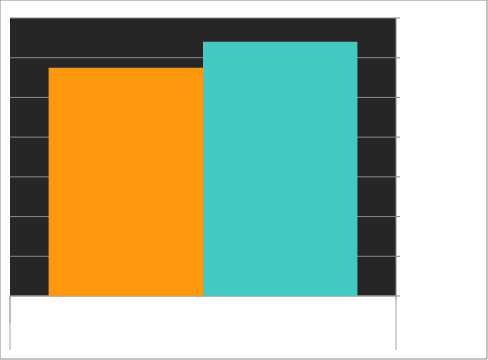
| Category | הכנסות | הוצאה |
|---|---|---|
| 0 | 3200 | 2874 |